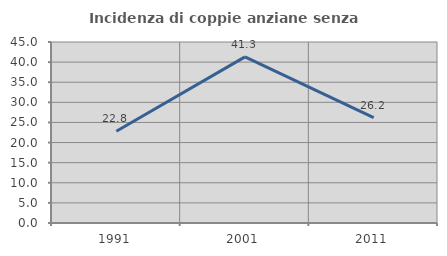
| Category | Incidenza di coppie anziane senza figli  |
|---|---|
| 1991.0 | 22.807 |
| 2001.0 | 41.304 |
| 2011.0 | 26.19 |